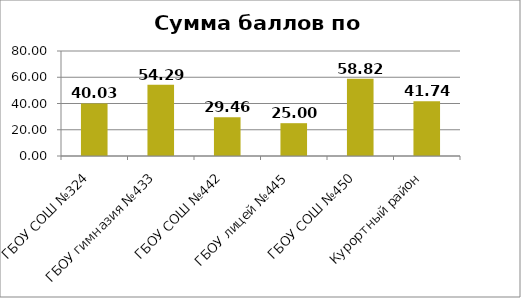
| Category | Сумма баллов Всего |
|---|---|
| ГБОУ СОШ №324 | 40.033 |
| ГБОУ гимназия №433 | 54.286 |
| ГБОУ СОШ №442 | 29.464 |
| ГБОУ лицей №445 | 25 |
| ГБОУ СОШ №450 | 58.824 |
| Курортный район | 41.736 |